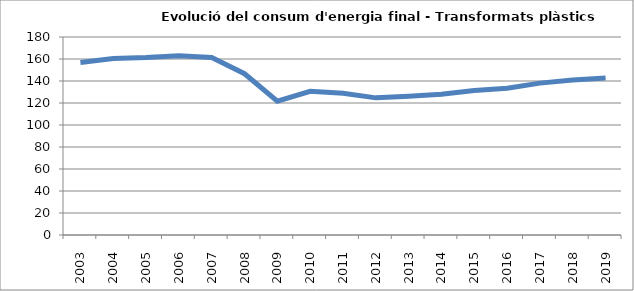
| Category | 156,9 |
|---|---|
| 2003.0 | 156.89 |
| 2004.0 | 160.43 |
| 2005.0 | 161.35 |
| 2006.0 | 163 |
| 2007.0 | 161.44 |
| 2008.0 | 146.61 |
| 2009.0 | 121.69 |
| 2010.0 | 130.58 |
| 2011.0 | 128.83 |
| 2012.0 | 124.67 |
| 2013.0 | 126.09 |
| 2014.0 | 127.89 |
| 2015.0 | 131.46 |
| 2016.0 | 133.39 |
| 2017.0 | 138.07 |
| 2018.0 | 140.87 |
| 2019.0 | 142.74 |